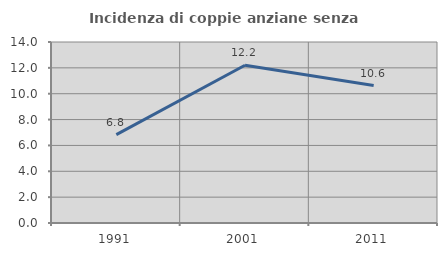
| Category | Incidenza di coppie anziane senza figli  |
|---|---|
| 1991.0 | 6.835 |
| 2001.0 | 12.203 |
| 2011.0 | 10.633 |